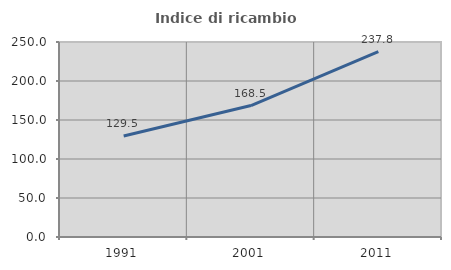
| Category | Indice di ricambio occupazionale  |
|---|---|
| 1991.0 | 129.462 |
| 2001.0 | 168.543 |
| 2011.0 | 237.785 |